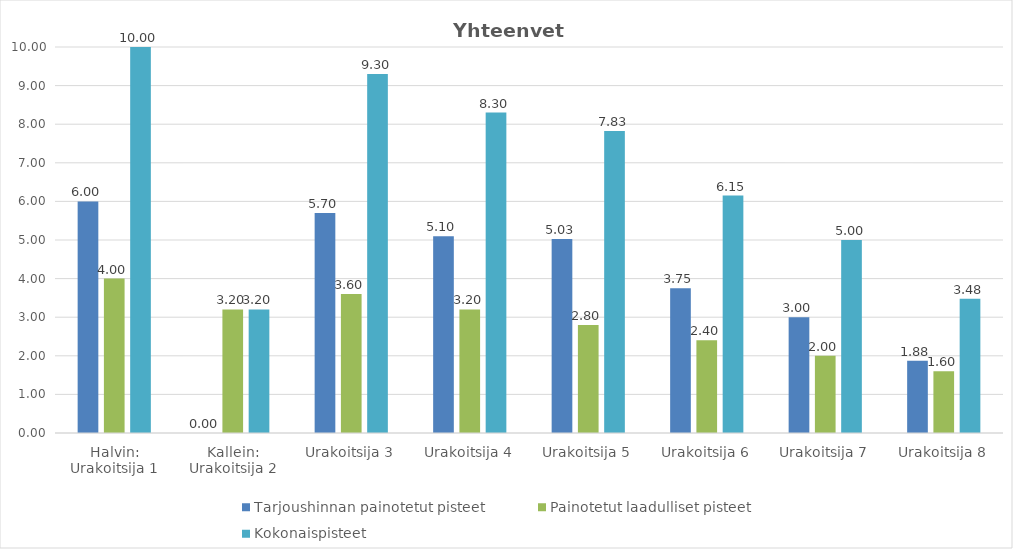
| Category | Tarjoushinnan painotetut pisteet | Painotetut laadulliset pisteet | Kokonaispisteet |
|---|---|---|---|
| Halvin: Urakoitsija 1 | 6 | 4 | 10 |
| Kallein: Urakoitsija 2 | 0 | 3.2 | 3.2 |
| Urakoitsija 3 | 5.7 | 3.6 | 9.3 |
| Urakoitsija 4 | 5.1 | 3.2 | 8.3 |
| Urakoitsija 5 | 5.025 | 2.8 | 7.825 |
| Urakoitsija 6 | 3.75 | 2.4 | 6.15 |
| Urakoitsija 7 | 3 | 2 | 5 |
| Urakoitsija 8 | 1.875 | 1.6 | 3.475 |